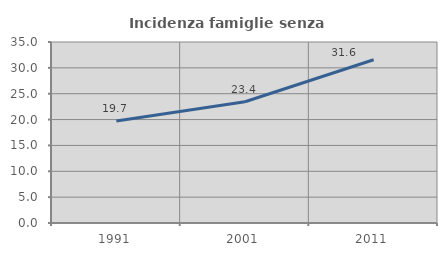
| Category | Incidenza famiglie senza nuclei |
|---|---|
| 1991.0 | 19.729 |
| 2001.0 | 23.438 |
| 2011.0 | 31.561 |